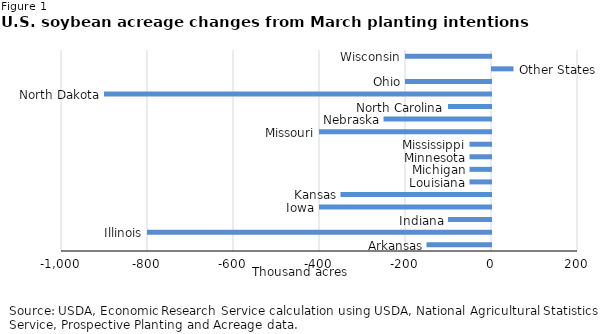
| Category | Change from March Intentions to June Acreage in thousand acres |
|---|---|
| Arkansas | -150 |
| Illinois | -800 |
| Indiana | -100 |
| Iowa | -400 |
| Kansas | -350 |
| Louisiana | -50 |
| Michigan | -50 |
| Minnesota | -50 |
| Mississippi | -50 |
| Missouri | -400 |
| Nebraska | -250 |
| North Carolina | -100 |
| North Dakota | -900 |
| Ohio | -200 |
| Other States | 50 |
| Wisconsin | -200 |